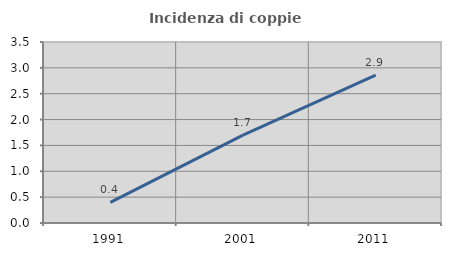
| Category | Incidenza di coppie miste |
|---|---|
| 1991.0 | 0.397 |
| 2001.0 | 1.698 |
| 2011.0 | 2.86 |